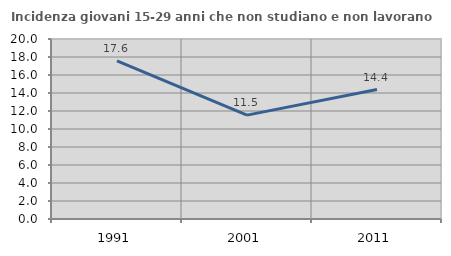
| Category | Incidenza giovani 15-29 anni che non studiano e non lavorano  |
|---|---|
| 1991.0 | 17.561 |
| 2001.0 | 11.544 |
| 2011.0 | 14.384 |